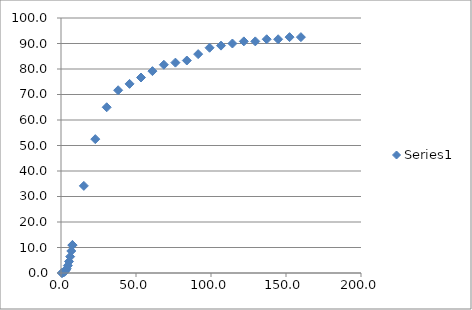
| Category | Series 0 |
|---|---|
| 0.5714285714285711 | 0 |
| 0.7619047619047616 | 0.025 |
| 1.5238095238095233 | 0.192 |
| 2.285714285714286 | 0.458 |
| 3.047619047619048 | 0.917 |
| 3.8095238095238093 | 1.675 |
| 4.571428571428571 | 2.908 |
| 5.333333333333333 | 4.525 |
| 6.095238095238096 | 6.417 |
| 6.857142857142858 | 8.633 |
| 7.619047619047619 | 11 |
| 7.619047619047619 | 10.867 |
| 15.238095238095237 | 34.167 |
| 22.857142857142854 | 52.5 |
| 30.476190476190474 | 65 |
| 38.095238095238095 | 71.667 |
| 45.71428571428571 | 74.167 |
| 53.33333333333333 | 76.667 |
| 60.95238095238095 | 79.167 |
| 68.57142857142857 | 81.667 |
| 76.26666666666667 | 82.5 |
| 83.88571428571427 | 83.333 |
| 91.42857142857142 | 85.833 |
| 99.04761904761905 | 88.333 |
| 106.66666666666666 | 89.167 |
| 114.28571428571429 | 90 |
| 121.9047619047619 | 90.833 |
| 129.52380952380952 | 90.833 |
| 137.14285714285714 | 91.667 |
| 144.76190476190476 | 91.667 |
| 152.38095238095238 | 92.5 |
| 159.92380952380952 | 92.5 |